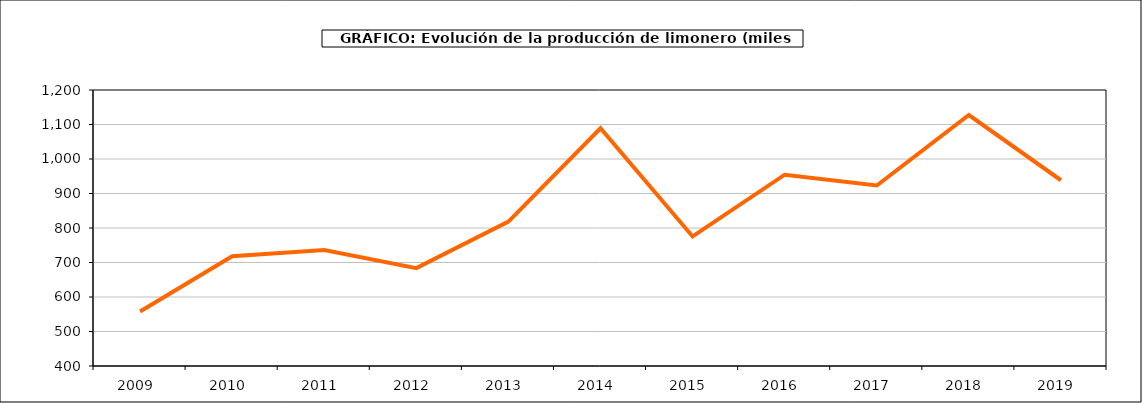
| Category | producción |
|---|---|
| 2009.0 | 558.18 |
| 2010.0 | 717.906 |
| 2011.0 | 736.198 |
| 2012.0 | 683.604 |
| 2013.0 | 818.489 |
| 2014.0 | 1088.964 |
| 2015.0 | 775.546 |
| 2016.0 | 954.479 |
| 2017.0 | 923.192 |
| 2018.0 | 1127.509 |
| 2019.0 | 938.42 |